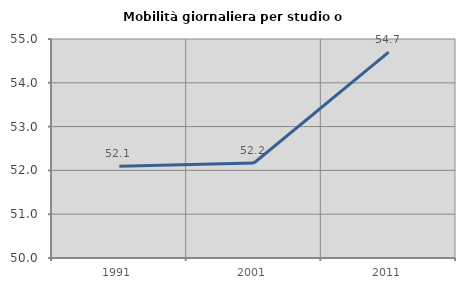
| Category | Mobilità giornaliera per studio o lavoro |
|---|---|
| 1991.0 | 52.092 |
| 2001.0 | 52.169 |
| 2011.0 | 54.702 |